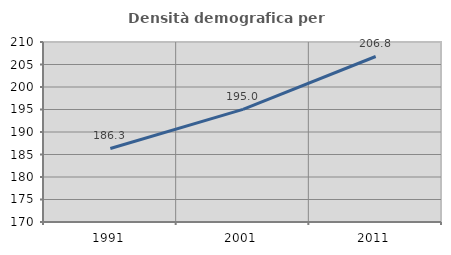
| Category | Densità demografica |
|---|---|
| 1991.0 | 186.338 |
| 2001.0 | 195.026 |
| 2011.0 | 206.781 |